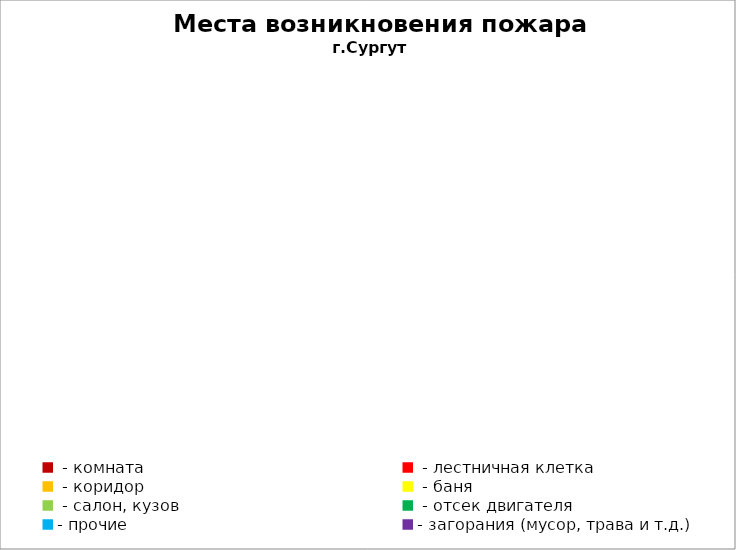
| Category | Места возникновения пожара |
|---|---|
|  - комната | 35 |
|  - лестничная клетка | 6 |
|  - коридор | 7 |
|  - баня | 12 |
|  - салон, кузов | 17 |
|  - отсек двигателя | 32 |
| - прочие | 108 |
| - загорания (мусор, трава и т.д.)  | 92 |